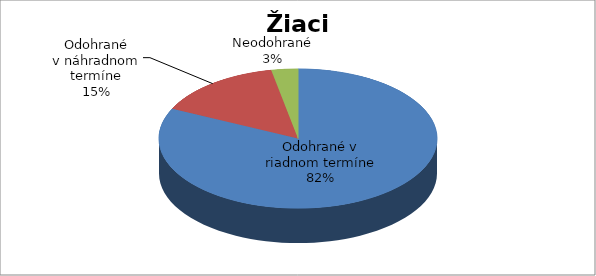
| Category | Series 0 |
|---|---|
| Odohrané v riadnom termíne | 612 |
| Odohrané v náhradnom termíne | 111 |
| Neodohrané | 23 |